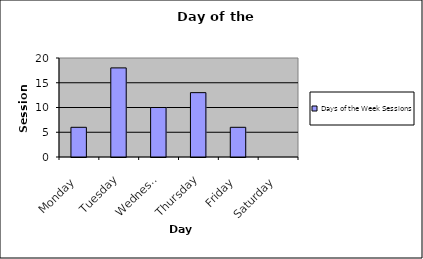
| Category | Days of the Week |
|---|---|
| Monday | 6 |
| Tuesday | 18 |
| Wednesday | 10 |
| Thursday | 13 |
| Friday | 6 |
| Saturday | 0 |